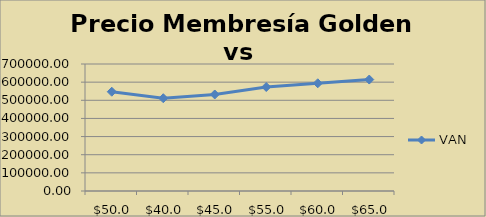
| Category | VAN |
|---|---|
| 50.0 | 547148.43 |
| 40.0 | 511355.737 |
| 45.0 | 531954.402 |
| 55.0 | 573151.734 |
| 60.0 | 593750.4 |
| 65.0 | 614349.065 |